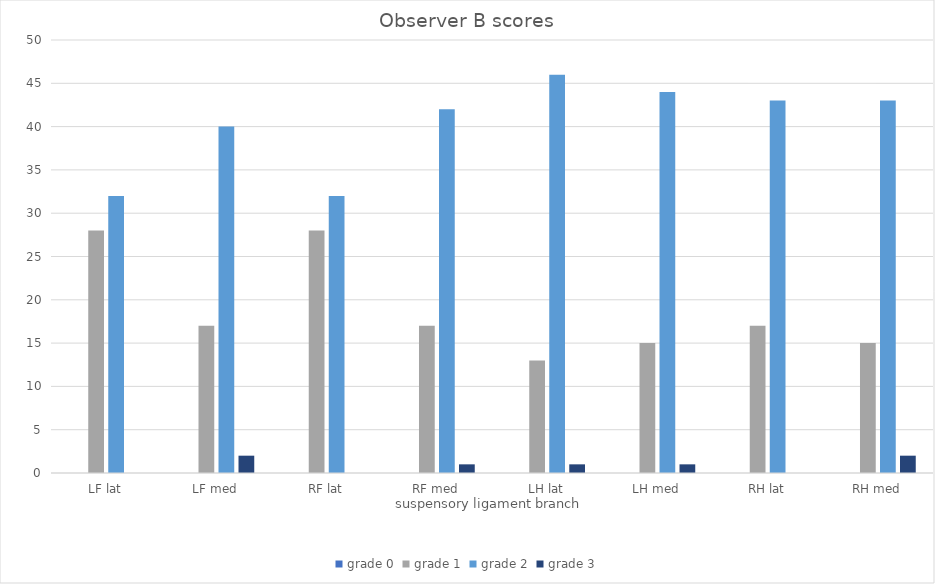
| Category | grade 0 | grade 1 | grade 2 | grade 3 |
|---|---|---|---|---|
| LF lat | 0 | 28 | 32 | 0 |
| LF med | 0 | 17 | 40 | 2 |
| RF lat | 0 | 28 | 32 | 0 |
| RF med | 0 | 17 | 42 | 1 |
| LH lat | 0 | 13 | 46 | 1 |
| LH med | 0 | 15 | 44 | 1 |
| RH lat | 0 | 17 | 43 | 0 |
| RH med | 0 | 15 | 43 | 2 |